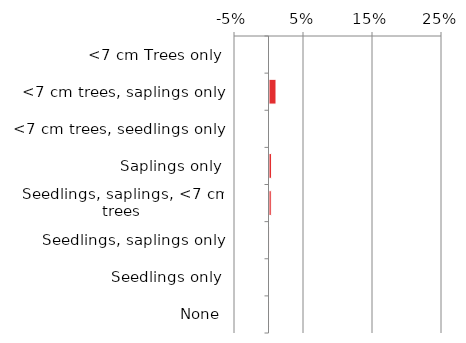
| Category | Near native & fragments |
|---|---|
| None | 0.001 |
| Seedlings only | 0 |
| Seedlings, saplings only | 0.001 |
| Seedlings, saplings, <7 cm trees | 0.004 |
| Saplings only | 0.004 |
| <7 cm trees, seedlings only | 0 |
| <7 cm trees, saplings only | 0.011 |
| <7 cm Trees only | 0 |